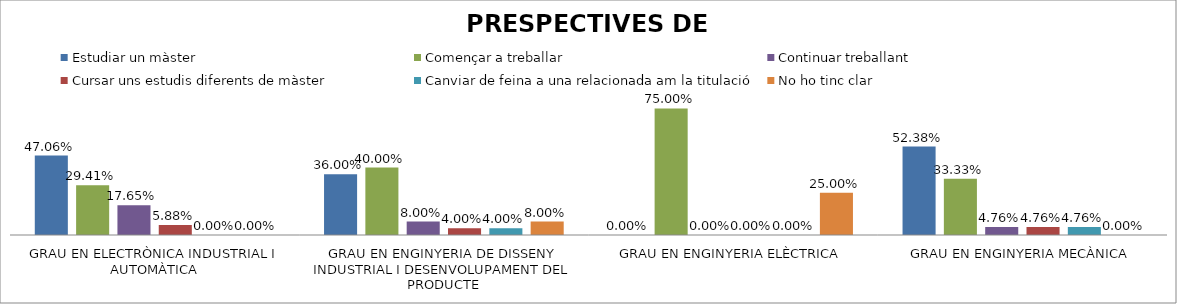
| Category | Estudiar un màster | Començar a treballar | Continuar treballant | Cursar uns estudis diferents de màster | Canviar de feina a una relacionada am la titulació | No ho tinc clar |
|---|---|---|---|---|---|---|
| GRAU EN ELECTRÒNICA INDUSTRIAL I AUTOMÀTICA | 0.471 | 0.294 | 0.176 | 0.059 | 0 | 0 |
| GRAU EN ENGINYERIA DE DISSENY INDUSTRIAL I DESENVOLUPAMENT DEL PRODUCTE | 0.36 | 0.4 | 0.08 | 0.04 | 0.04 | 0.08 |
| GRAU EN ENGINYERIA ELÈCTRICA | 0 | 0.75 | 0 | 0 | 0 | 0.25 |
| GRAU EN ENGINYERIA MECÀNICA | 0.524 | 0.333 | 0.048 | 0.048 | 0.048 | 0 |